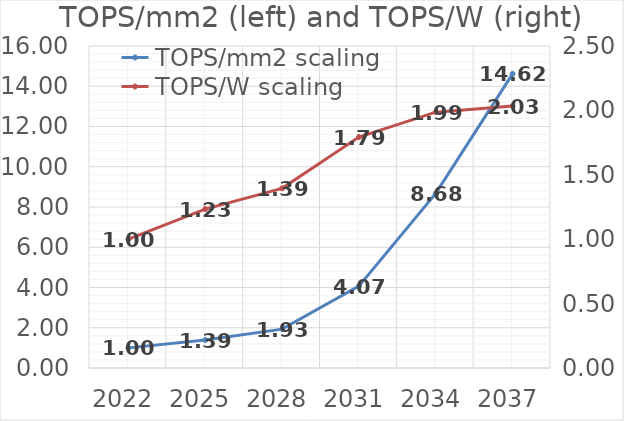
| Category | TOPS/mm2 scaling |
|---|---|
| 2022.0 | 1 |
| 2025.0 | 1.388 |
| 2028.0 | 1.932 |
| 2031.0 | 4.069 |
| 2034.0 | 8.678 |
| 2037.0 | 14.617 |